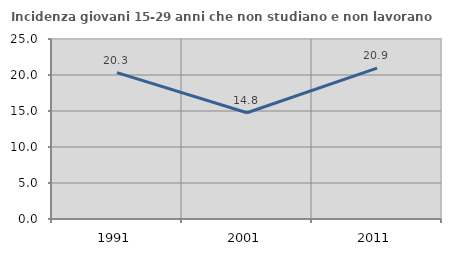
| Category | Incidenza giovani 15-29 anni che non studiano e non lavorano  |
|---|---|
| 1991.0 | 20.321 |
| 2001.0 | 14.754 |
| 2011.0 | 20.946 |